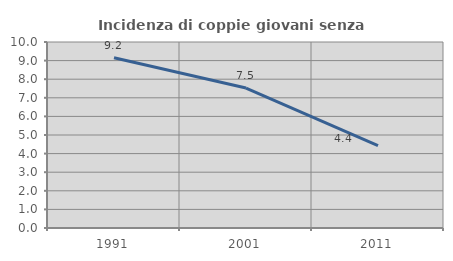
| Category | Incidenza di coppie giovani senza figli |
|---|---|
| 1991.0 | 9.15 |
| 2001.0 | 7.525 |
| 2011.0 | 4.432 |